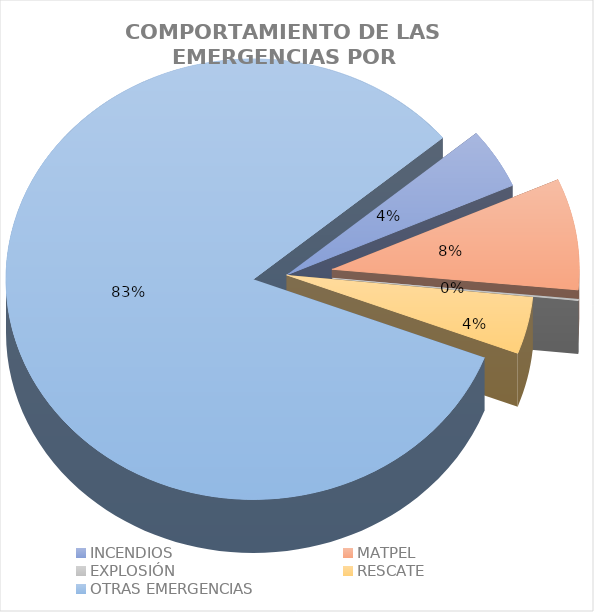
| Category | Series 0 |
|---|---|
| INCENDIOS | 0.044 |
| MATPEL | 0.082 |
| EXPLOSIÓN | 0.001 |
| RESCATE | 0.042 |
| OTRAS EMERGENCIAS | 0.831 |